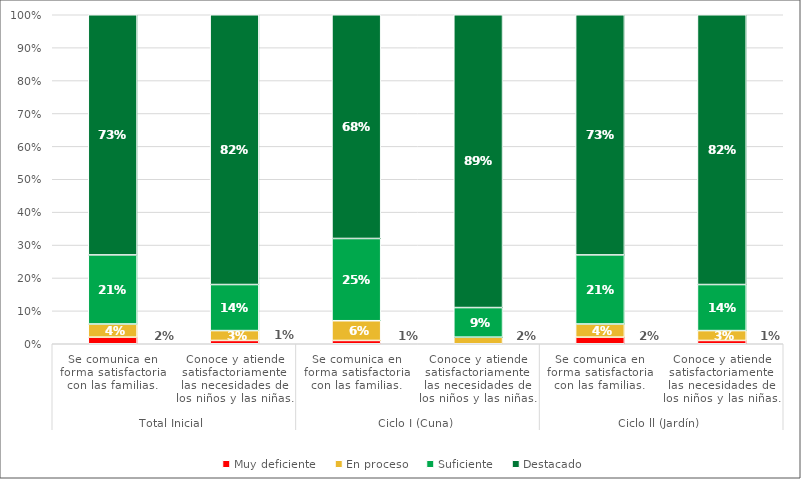
| Category | Muy deficiente | En proceso | Suficiente | Destacado |
|---|---|---|---|---|
| 0 | 0.02 | 0.04 | 0.21 | 0.73 |
| 1 | 0.01 | 0.03 | 0.14 | 0.82 |
| 2 | 0.01 | 0.06 | 0.25 | 0.68 |
| 3 | 0 | 0.02 | 0.09 | 0.89 |
| 4 | 0.02 | 0.04 | 0.21 | 0.73 |
| 5 | 0.01 | 0.03 | 0.14 | 0.82 |